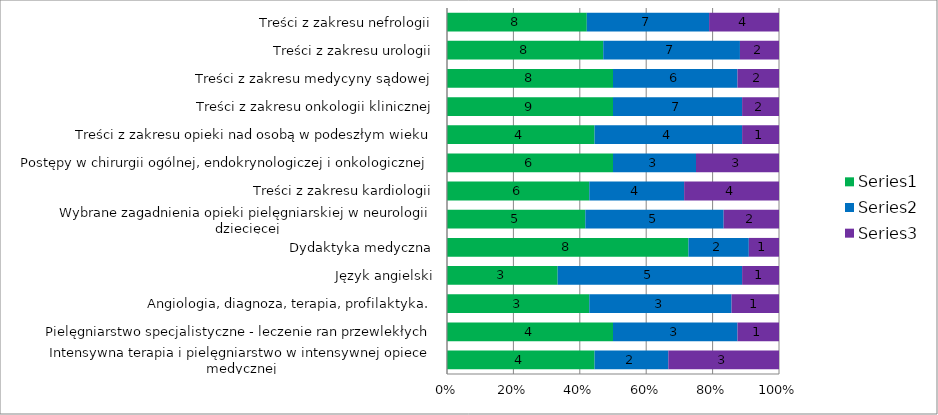
| Category | Series 0 | Series 1 | Series 2 |
|---|---|---|---|
| Intensywna terapia i pielęgniarstwo w intensywnej opiece medycznej | 4 | 2 | 3 |
| Pielęgniarstwo specjalistyczne - leczenie ran przewlekłych | 4 | 3 | 1 |
| Angiologia, diagnoza, terapia, profilaktyka. | 3 | 3 | 1 |
| Język angielski | 3 | 5 | 1 |
| Dydaktyka medyczna | 8 | 2 | 1 |
| Wybrane zagadnienia opieki pielęgniarskiej w neurologii dziecięcej | 5 | 5 | 2 |
| Treści z zakresu kardiologii | 6 | 4 | 4 |
| Postępy w chirurgii ogólnej, endokrynologiczej i onkologicznej | 6 | 3 | 3 |
| Treści z zakresu opieki nad osobą w podeszłym wieku | 4 | 4 | 1 |
| Treści z zakresu onkologii klinicznej | 9 | 7 | 2 |
| Treści z zakresu medycyny sądowej | 8 | 6 | 2 |
| Treści z zakresu urologii | 8 | 7 | 2 |
| Treści z zakresu nefrologii | 8 | 7 | 4 |